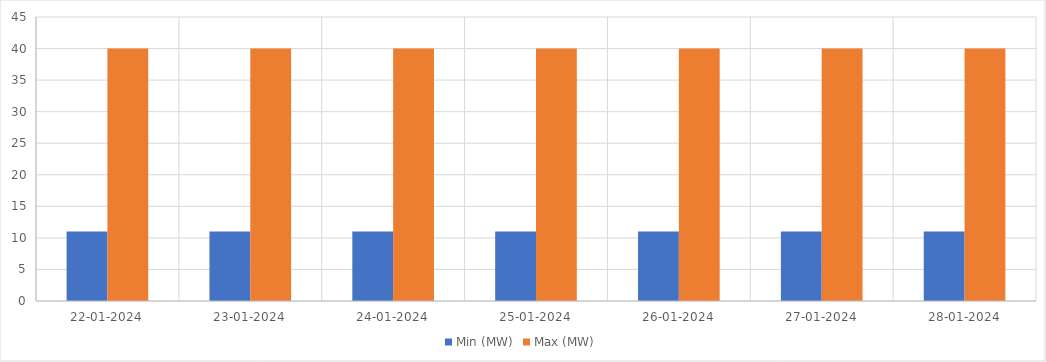
| Category | Min (MW) | Max (MW) |
|---|---|---|
| 22-01-2024 | 11 | 40 |
| 23-01-2024 | 11 | 40 |
| 24-01-2024 | 11 | 40 |
| 25-01-2024 | 11 | 40 |
| 26-01-2024 | 11 | 40 |
| 27-01-2024 | 11 | 40 |
| 28-01-2024 | 11 | 40 |